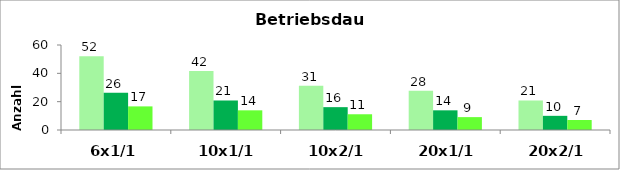
| Category | Series 0 | Series 3 | Series 6 |
|---|---|---|---|
| 6x1/1 | 52.083 | 26.316 | 16.667 |
| 10x1/1 | 41.667 | 20.833 | 13.889 |
| 10x2/1 | 31.25 | 16.129 | 11.111 |
| 20x1/1 | 27.778 | 13.889 | 9.091 |
| 20x2/1 | 20.833 | 10 | 7.042 |